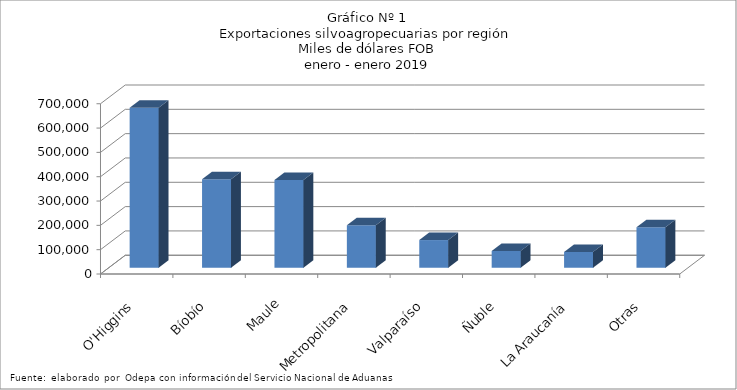
| Category | Series 0 |
|---|---|
| O'Higgins | 657828.349 |
| Bíobío | 364180.682 |
| Maule | 360658.753 |
| Metropolitana | 175181.387 |
| Valparaíso | 113835.813 |
| Ñuble | 69120.638 |
| La Araucanía | 64962.95 |
| Otras | 166456.57 |